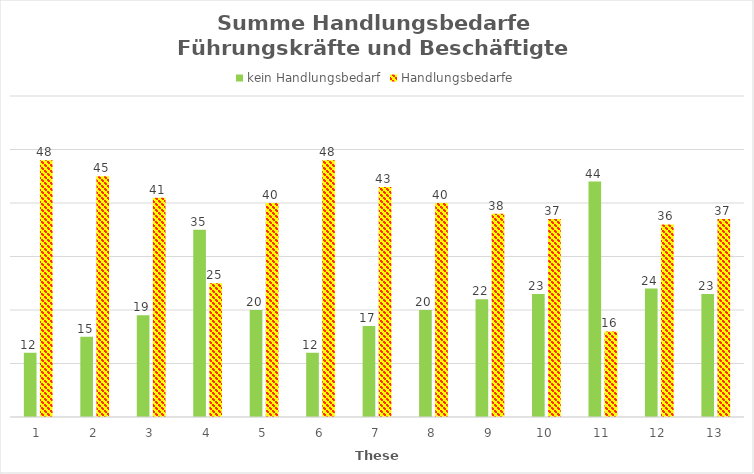
| Category | kein Handlungsbedarf | Handlungsbedarfe |
|---|---|---|
| 1.0 | 12 | 48 |
| 2.0 | 15 | 45 |
| 3.0 | 19 | 41 |
| 4.0 | 35 | 25 |
| 5.0 | 20 | 40 |
| 6.0 | 12 | 48 |
| 7.0 | 17 | 43 |
| 8.0 | 20 | 40 |
| 9.0 | 22 | 38 |
| 10.0 | 23 | 37 |
| 11.0 | 44 | 16 |
| 12.0 | 24 | 36 |
| 13.0 | 23 | 37 |